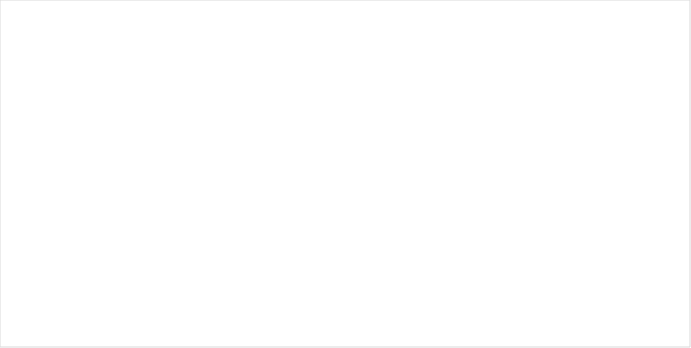
| Category | Peso |
|---|---|
| P. Pesca | 0 |
| P. Consumo | 0 |
| P. Uso cotidiano | 0 |
| P. Particulado | 0 |
| Caucho | 0 |
| Tela | 0 |
| Papel y cartón | 0 |
| Madera | 0 |
| Metal | 0 |
| Vidrio | 0 |
| Cerámica | 0 |
| Sanitarios y médicos | 0 |
| Otros | 0 |